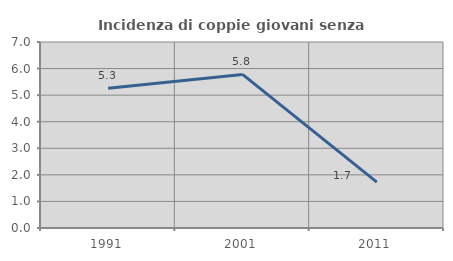
| Category | Incidenza di coppie giovani senza figli |
|---|---|
| 1991.0 | 5.263 |
| 2001.0 | 5.78 |
| 2011.0 | 1.724 |